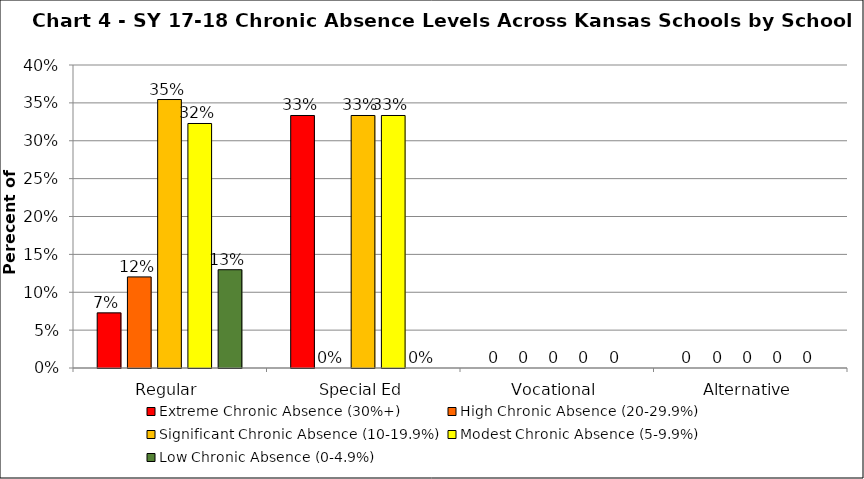
| Category | Extreme Chronic Absence (30%+) | High Chronic Absence (20-29.9%) | Significant Chronic Absence (10-19.9%) | Modest Chronic Absence (5-9.9%) | Low Chronic Absence (0-4.9%) |
|---|---|---|---|---|---|
| 0 | 0.073 | 0.12 | 0.354 | 0.323 | 0.13 |
| 1 | 0.333 | 0 | 0.333 | 0.333 | 0 |
| 2 | 0 | 0 | 0 | 0 | 0 |
| 3 | 0 | 0 | 0 | 0 | 0 |